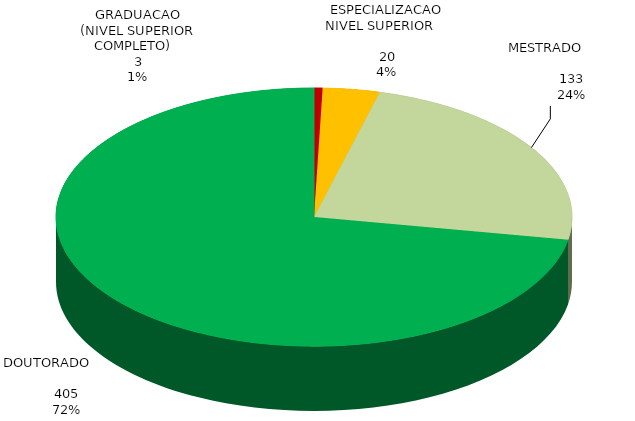
| Category | Total Geral |
|---|---|
| GRADUACAO (NIVEL SUPERIOR COMPLETO)   | 3 |
| ESPECIALIZACAO NIVEL SUPERIOR         | 20 |
| MESTRADO                              | 133 |
| DOUTORADO                             | 405 |